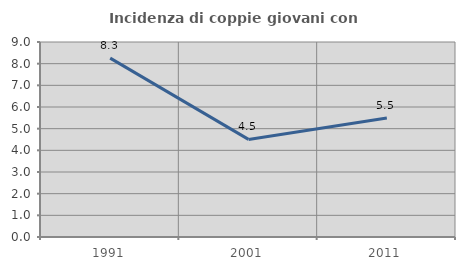
| Category | Incidenza di coppie giovani con figli |
|---|---|
| 1991.0 | 8.257 |
| 2001.0 | 4.505 |
| 2011.0 | 5.495 |